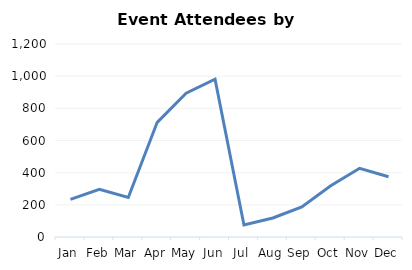
| Category | Event Attendees |
|---|---|
| Jan | 234 |
| Feb | 296 |
| Mar | 246 |
| Apr | 713 |
| May | 894 |
| Jun | 981 |
| Jul | 75 |
| Aug | 118 |
| Sep | 187 |
| Oct | 319 |
| Nov | 427 |
| Dec | 375 |